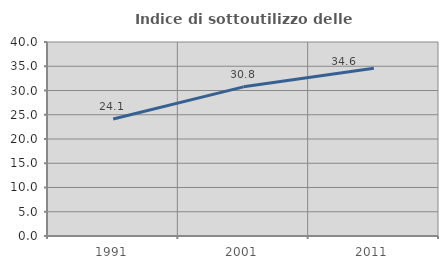
| Category | Indice di sottoutilizzo delle abitazioni  |
|---|---|
| 1991.0 | 24.119 |
| 2001.0 | 30.754 |
| 2011.0 | 34.591 |